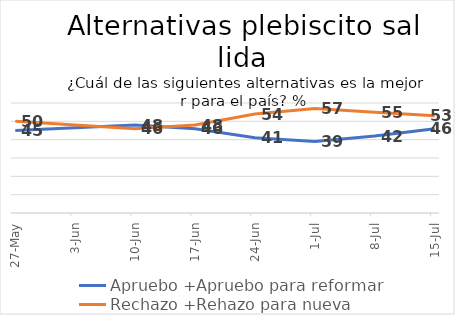
| Category | Apruebo +Apruebo para reformar | Rechazo +Rehazo para nueva |
|---|---|---|
| 2022-05-27 | 45 | 50 |
| 2022-06-10 | 48 | 46 |
| 2022-06-17 | 46 | 48 |
| 2022-06-24 | 41 | 54 |
| 2022-07-01 | 39 | 57 |
| 2022-07-08 | 42 | 55 |
| 2022-07-15 | 46 | 53 |